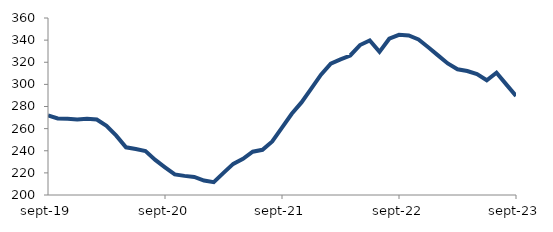
| Category | Series 0 |
|---|---|
| 2019-09-01 | 271.909 |
| 2019-10-01 | 269.246 |
| 2019-11-01 | 268.873 |
| 2019-12-01 | 268.319 |
| 2020-01-01 | 268.914 |
| 2020-02-01 | 268.233 |
| 2020-03-01 | 262.58 |
| 2020-04-01 | 253.663 |
| 2020-05-01 | 243.088 |
| 2020-06-01 | 241.541 |
| 2020-07-01 | 239.786 |
| 2020-08-01 | 231.766 |
| 2020-09-01 | 225.047 |
| 2020-10-01 | 218.571 |
| 2020-11-01 | 217.286 |
| 2020-12-01 | 216.368 |
| 2021-01-01 | 213.087 |
| 2021-02-01 | 211.643 |
| 2021-03-01 | 220.04 |
| 2021-04-01 | 228.12 |
| 2021-05-01 | 232.717 |
| 2021-06-01 | 239.097 |
| 2021-07-01 | 240.846 |
| 2021-08-01 | 248.449 |
| 2021-09-01 | 260.934 |
| 2021-10-01 | 273.441 |
| 2021-11-01 | 283.683 |
| 2021-12-01 | 296.134 |
| 2022-01-01 | 308.804 |
| 2022-02-01 | 318.726 |
| 2022-03-01 | 322.592 |
| 2022-04-01 | 326.114 |
| 2022-05-01 | 335.557 |
| 2022-06-01 | 339.684 |
| 2022-07-01 | 329.357 |
| 2022-08-01 | 341.293 |
| 2022-09-01 | 344.793 |
| 2022-10-01 | 344.185 |
| 2022-11-01 | 340.608 |
| 2022-12-01 | 333.559 |
| 2023-01-01 | 326.199 |
| 2023-02-01 | 318.915 |
| 2023-03-01 | 313.615 |
| 2023-04-01 | 312.076 |
| 2023-05-01 | 309.232 |
| 2023-06-01 | 303.714 |
| 2023-07-01 | 310.493 |
| 2023-08-01 | 299.987 |
| 2023-09-01 | 289.543 |